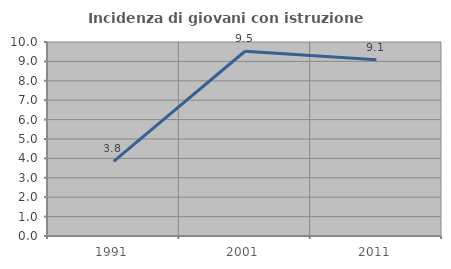
| Category | Incidenza di giovani con istruzione universitaria |
|---|---|
| 1991.0 | 3.846 |
| 2001.0 | 9.524 |
| 2011.0 | 9.091 |